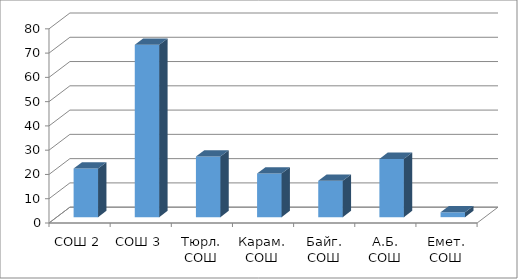
| Category | Series 0 |
|---|---|
| СОШ 2 | 20 |
| СОШ 3 | 71 |
| Тюрл. СОШ | 25 |
| Карам. СОШ | 18 |
| Байг. СОШ | 15 |
| А.Б. СОШ | 24 |
| Емет. СОШ | 2 |